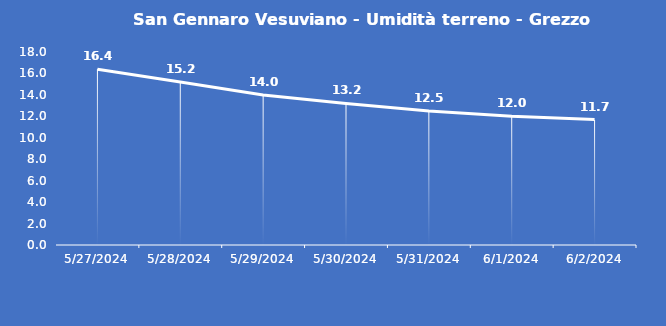
| Category | San Gennaro Vesuviano - Umidità terreno - Grezzo (%VWC) |
|---|---|
| 5/27/24 | 16.4 |
| 5/28/24 | 15.2 |
| 5/29/24 | 14 |
| 5/30/24 | 13.2 |
| 5/31/24 | 12.5 |
| 6/1/24 | 12 |
| 6/2/24 | 11.7 |